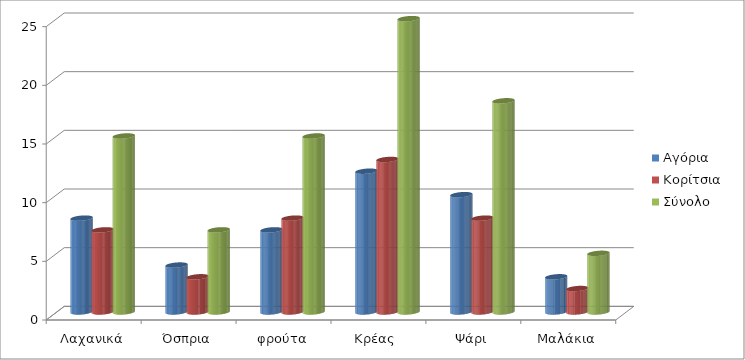
| Category | Αγόρια  | Κορίτσια  | Σύνολο  |
|---|---|---|---|
| Λαχανικά | 8 | 7 | 15 |
| Όσπρια | 4 | 3 | 7 |
| φρούτα | 7 | 8 | 15 |
| Κρέας  | 12 | 13 | 25 |
| Ψάρι | 10 | 8 | 18 |
| Μαλάκια | 3 | 2 | 5 |